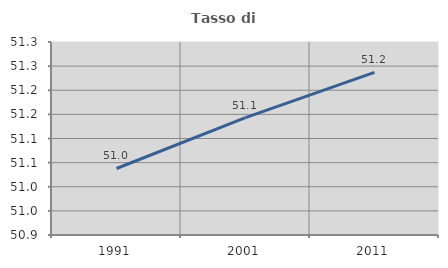
| Category | Tasso di occupazione   |
|---|---|
| 1991.0 | 51.038 |
| 2001.0 | 51.143 |
| 2011.0 | 51.237 |